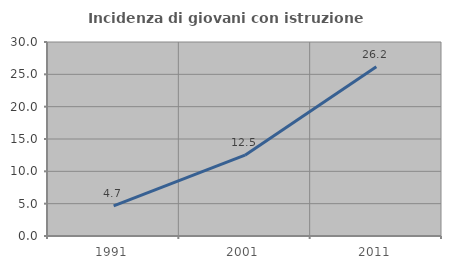
| Category | Incidenza di giovani con istruzione universitaria |
|---|---|
| 1991.0 | 4.651 |
| 2001.0 | 12.5 |
| 2011.0 | 26.19 |